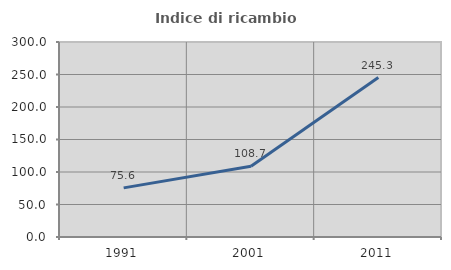
| Category | Indice di ricambio occupazionale  |
|---|---|
| 1991.0 | 75.581 |
| 2001.0 | 108.714 |
| 2011.0 | 245.333 |